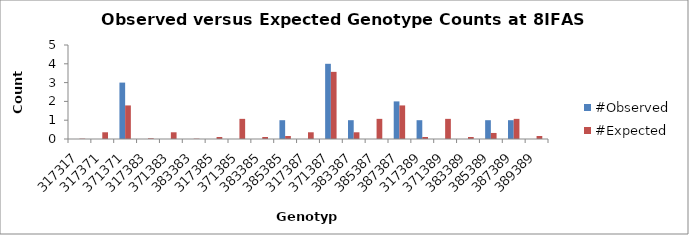
| Category | #Observed | #Expected |
|---|---|---|
| 317317.0 | 0 | 0.018 |
| 317371.0 | 0 | 0.357 |
| 371371.0 | 3 | 1.786 |
| 317383.0 | 0 | 0.036 |
| 371383.0 | 0 | 0.357 |
| 383383.0 | 0 | 0.018 |
| 317385.0 | 0 | 0.107 |
| 371385.0 | 0 | 1.071 |
| 383385.0 | 0 | 0.107 |
| 385385.0 | 1 | 0.161 |
| 317387.0 | 0 | 0.357 |
| 371387.0 | 4 | 3.571 |
| 383387.0 | 1 | 0.357 |
| 385387.0 | 0 | 1.071 |
| 387387.0 | 2 | 1.786 |
| 317389.0 | 1 | 0.107 |
| 371389.0 | 0 | 1.071 |
| 383389.0 | 0 | 0.107 |
| 385389.0 | 1 | 0.321 |
| 387389.0 | 1 | 1.071 |
| 389389.0 | 0 | 0.161 |